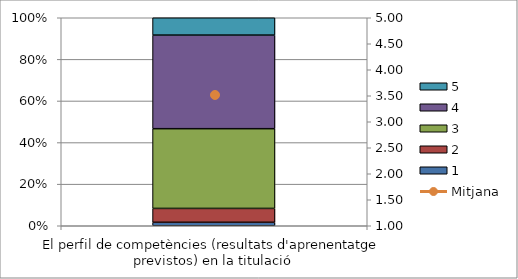
| Category | 1 | 2 | 3 | 4 | 5 |
|---|---|---|---|---|---|
| El perfil de competències (resultats d'aprenentatge previstos) en la titulació | 1 | 4 | 23 | 27 | 5 |